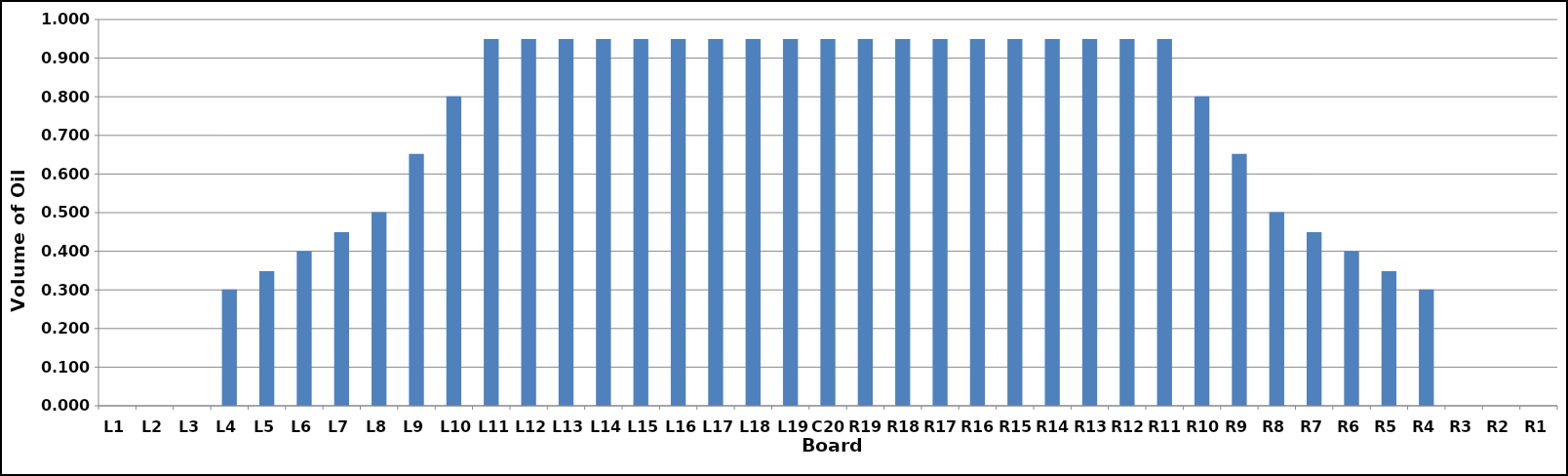
| Category | Series 0 |
|---|---|
| L1 | 0 |
| L2 | 0 |
| L3 | 0 |
| L4 | 0.301 |
| L5 | 0.348 |
| L6 | 0.4 |
| L7 | 0.45 |
| L8 | 0.501 |
| L9 | 0.652 |
| L10 | 0.801 |
| L11 | 0.949 |
| L12 | 0.949 |
| L13 | 0.949 |
| L14 | 0.949 |
| L15 | 0.949 |
| L16 | 0.949 |
| L17 | 0.949 |
| L18 | 0.949 |
| L19 | 0.949 |
| C20 | 0.949 |
| R19 | 0.949 |
| R18 | 0.949 |
| R17 | 0.949 |
| R16 | 0.949 |
| R15 | 0.949 |
| R14 | 0.949 |
| R13 | 0.949 |
| R12 | 0.949 |
| R11 | 0.949 |
| R10 | 0.801 |
| R9 | 0.652 |
| R8 | 0.501 |
| R7 | 0.45 |
| R6 | 0.4 |
| R5 | 0.348 |
| R4 | 0.301 |
| R3 | 0 |
| R2 | 0 |
| R1 | 0 |